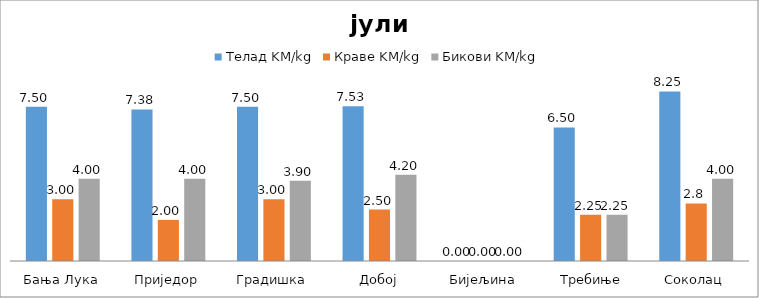
| Category | Телад KM/kg | Краве KM/kg | Бикови KM/kg |
|---|---|---|---|
| Бања Лука | 7.5 | 3 | 4 |
| Приједор | 7.375 | 2 | 4 |
| Градишка | 7.5 | 3 | 3.9 |
| Добој | 7.525 | 2.5 | 4.2 |
| Бијељина | 0 | 0 | 0 |
|  Требиње | 6.5 | 2.25 | 2.25 |
| Соколац | 8.25 | 2.8 | 4 |